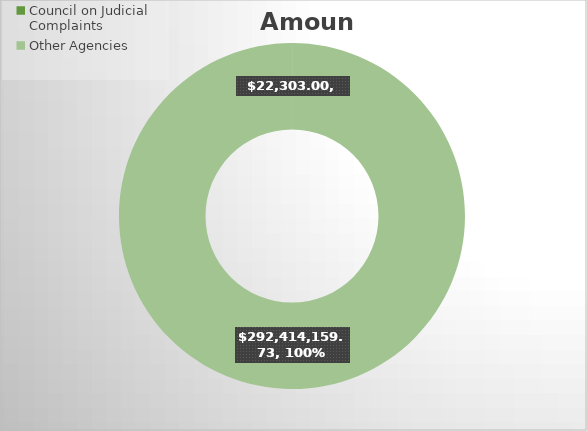
| Category | Amount |
|---|---|
| Council on Judicial Complaints | 22303 |
| Other Agencies | 292414159.73 |